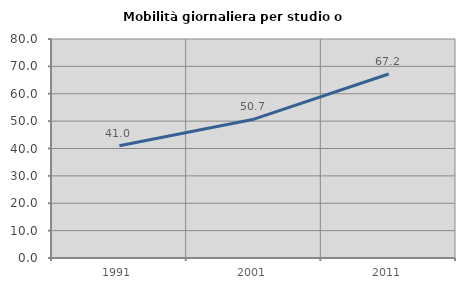
| Category | Mobilità giornaliera per studio o lavoro |
|---|---|
| 1991.0 | 41.034 |
| 2001.0 | 50.705 |
| 2011.0 | 67.201 |